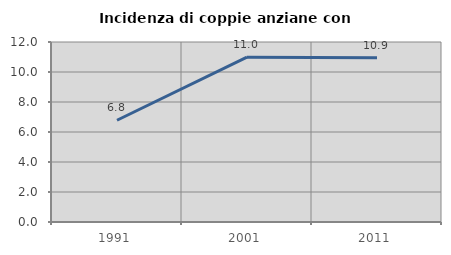
| Category | Incidenza di coppie anziane con figli |
|---|---|
| 1991.0 | 6.785 |
| 2001.0 | 10.989 |
| 2011.0 | 10.947 |